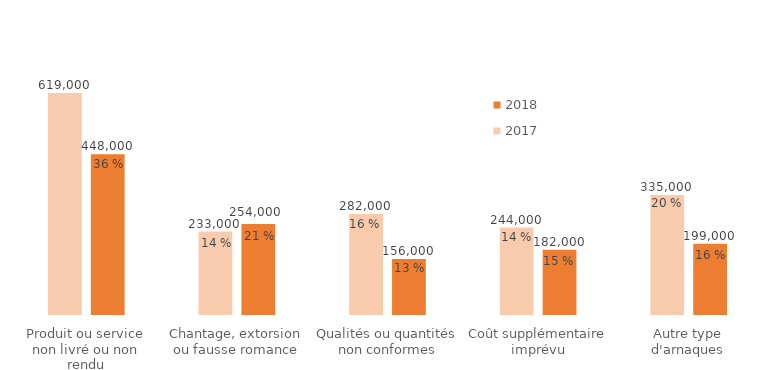
| Category | 2018 | 2017 |
|---|---|---|
| Autre type d'arnaques | 199000 | 335000 |
| Coût supplémentaire imprévu | 182000 | 244000 |
| Qualités ou quantités non conformes | 156000 | 282000 |
| Chantage, extorsion ou fausse romance | 254000 | 233000 |
| Produit ou service non livré ou non rendu | 448000 | 619000 |